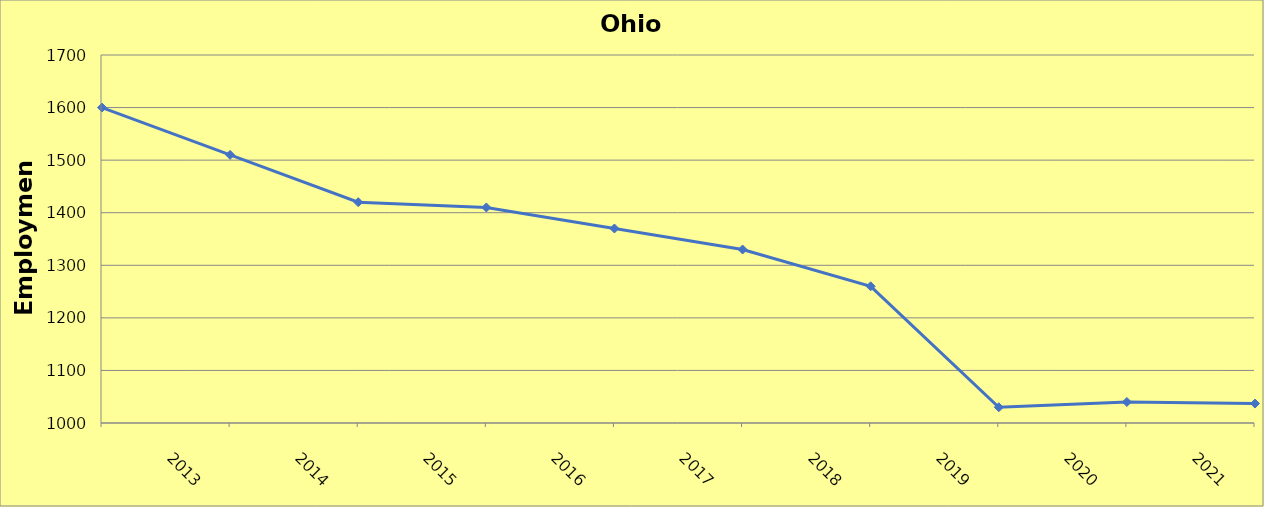
| Category | Ohio County |
|---|---|
| 2013.0 | 1600 |
| 2014.0 | 1510 |
| 2015.0 | 1420 |
| 2016.0 | 1410 |
| 2017.0 | 1370 |
| 2018.0 | 1330 |
| 2019.0 | 1260 |
| 2020.0 | 1030 |
| 2021.0 | 1040 |
| 2022.0 | 1037 |